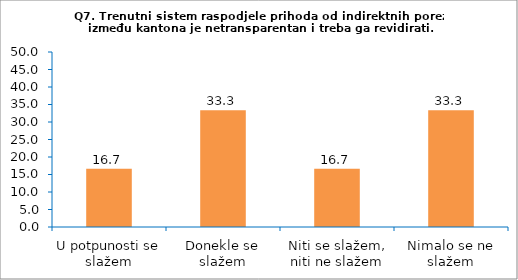
| Category | Series 0 |
|---|---|
| U potpunosti se slažem | 16.667 |
| Donekle se slažem | 33.333 |
| Niti se slažem, niti ne slažem | 16.667 |
| Nimalo se ne slažem | 33.333 |